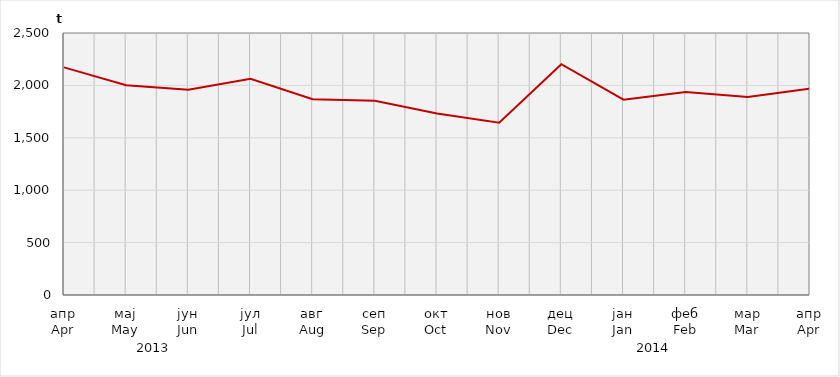
| Category | Нето тежина заклане стоке                              Net weight of  slaughtered livestock |
|---|---|
| апр
Apr | 2171949.16 |
| мај
May | 2000890.05 |
| јун
Jun | 1958717.5 |
| јул
Jul | 2062735.23 |
| авг
Aug | 1867860.8 |
| сеп
Sep | 1852800.6 |
| окт
Oct | 1731807.5 |
| нов
Nov | 1643818.93 |
| дец
Dec | 2201954.6 |
| јан
Jan | 1864263.38 |
| феб
Feb | 1937876.26 |
| мар
Mar | 1889500 |
| апр
Apr | 1970100 |